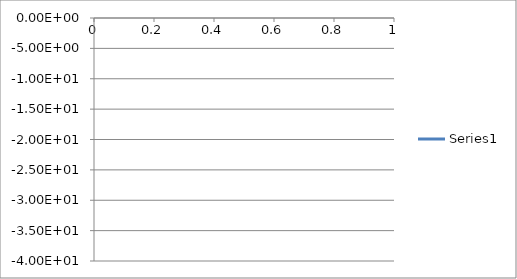
| Category | Series 0 |
|---|---|
| 0 | -36.166 |
| 1 | -36.49 |
| 2 | -37.07 |
| 3 | -37.604 |
| 4 | -38.084 |
| 5 | -37.881 |
| 6 | -36.799 |
| 7 | -35.068 |
| 8 | -33.107 |
| 9 | -31.198 |
| 10 | -29.396 |
| 11 | -27.785 |
| 12 | -26.277 |
| 13 | -24.936 |
| 14 | -23.688 |
| 15 | -22.553 |
| 16 | -21.5 |
| 17 | -20.542 |
| 18 | -19.64 |
| 19 | -18.815 |
| 20 | -18.034 |
| 21 | -17.314 |
| 22 | -16.635 |
| 23 | -16.007 |
| 24 | -15.413 |
| 25 | -14.862 |
| 26 | -14.34 |
| 27 | -13.857 |
| 28 | -13.401 |
| 29 | -12.976 |
| 30 | -12.577 |
| 31 | -12.208 |
| 32 | -11.859 |
| 33 | -11.54 |
| 34 | -11.238 |
| 35 | -10.963 |
| 36 | -10.706 |
| 37 | -10.471 |
| 38 | -10.256 |
| 39 | -10.062 |
| 40 | -9.883 |
| 41 | -9.725 |
| 42 | -9.584 |
| 43 | -9.461 |
| 44 | -9.355 |
| 45 | -9.263 |
| 46 | -9.189 |
| 47 | -9.132 |
| 48 | -9.088 |
| 49 | -9.06 |
| 50 | -9.045 |
| 51 | -9.045 |
| 52 | -9.059 |
| 53 | -9.084 |
| 54 | -9.124 |
| 55 | -9.173 |
| 56 | -9.233 |
| 57 | -9.302 |
| 58 | -9.383 |
| 59 | -9.469 |
| 60 | -9.562 |
| 61 | -9.657 |
| 62 | -9.759 |
| 63 | -9.857 |
| 64 | -9.958 |
| 65 | -10.053 |
| 66 | -10.144 |
| 67 | -10.225 |
| 68 | -10.297 |
| 69 | -10.353 |
| 70 | -10.394 |
| 71 | -10.418 |
| 72 | -10.422 |
| 73 | -10.404 |
| 74 | -10.369 |
| 75 | -10.307 |
| 76 | -10.226 |
| 77 | -10.125 |
| 78 | -10.003 |
| 79 | -9.867 |
| 80 | -9.713 |
| 81 | -9.549 |
| 82 | -9.371 |
| 83 | -9.188 |
| 84 | -8.996 |
| 85 | -8.802 |
| 86 | -8.604 |
| 87 | -8.407 |
| 88 | -8.209 |
| 89 | -8.016 |
| 90 | -7.823 |
| 91 | -7.636 |
| 92 | -7.452 |
| 93 | -7.275 |
| 94 | -7.102 |
| 95 | -6.937 |
| 96 | -6.775 |
| 97 | -6.622 |
| 98 | -6.471 |
| 99 | -6.331 |
| 100 | -6.194 |
| 101 | -6.064 |
| 102 | -5.938 |
| 103 | -5.819 |
| 104 | -5.705 |
| 105 | -5.594 |
| 106 | -5.488 |
| 107 | -5.387 |
| 108 | -5.288 |
| 109 | -5.193 |
| 110 | -5.1 |
| 111 | -5.01 |
| 112 | -4.924 |
| 113 | -4.838 |
| 114 | -4.754 |
| 115 | -4.672 |
| 116 | -4.589 |
| 117 | -4.509 |
| 118 | -4.428 |
| 119 | -4.35 |
| 120 | -4.271 |
| 121 | -4.192 |
| 122 | -4.114 |
| 123 | -4.037 |
| 124 | -3.959 |
| 125 | -3.883 |
| 126 | -3.807 |
| 127 | -3.733 |
| 128 | -3.659 |
| 129 | -3.586 |
| 130 | -3.514 |
| 131 | -3.446 |
| 132 | -3.377 |
| 133 | -3.312 |
| 134 | -3.25 |
| 135 | -3.19 |
| 136 | -3.133 |
| 137 | -3.079 |
| 138 | -3.029 |
| 139 | -2.984 |
| 140 | -2.94 |
| 141 | -2.903 |
| 142 | -2.869 |
| 143 | -2.84 |
| 144 | -2.816 |
| 145 | -2.797 |
| 146 | -2.783 |
| 147 | -2.775 |
| 148 | -2.772 |
| 149 | -2.773 |
| 150 | -2.782 |
| 151 | -2.795 |
| 152 | -2.816 |
| 153 | -2.839 |
| 154 | -2.87 |
| 155 | -2.907 |
| 156 | -2.948 |
| 157 | -2.995 |
| 158 | -3.047 |
| 159 | -3.106 |
| 160 | -3.167 |
| 161 | -3.234 |
| 162 | -3.307 |
| 163 | -3.381 |
| 164 | -3.462 |
| 165 | -3.545 |
| 166 | -3.629 |
| 167 | -3.718 |
| 168 | -3.807 |
| 169 | -3.897 |
| 170 | -3.988 |
| 171 | -4.078 |
| 172 | -4.168 |
| 173 | -4.254 |
| 174 | -4.34 |
| 175 | -4.421 |
| 176 | -4.497 |
| 177 | -4.567 |
| 178 | -4.631 |
| 179 | -4.688 |
| 180 | -4.738 |
| 181 | -4.776 |
| 182 | -4.807 |
| 183 | -4.827 |
| 184 | -4.838 |
| 185 | -4.836 |
| 186 | -4.825 |
| 187 | -4.804 |
| 188 | -4.771 |
| 189 | -4.729 |
| 190 | -4.676 |
| 191 | -4.614 |
| 192 | -4.543 |
| 193 | -4.463 |
| 194 | -4.378 |
| 195 | -4.286 |
| 196 | -4.188 |
| 197 | -4.085 |
| 198 | -3.979 |
| 199 | -3.869 |
| 200 | -3.756 |
| 201 | -3.643 |
| 202 | -3.527 |
| 203 | -3.412 |
| 204 | -3.297 |
| 205 | -3.181 |
| 206 | -3.07 |
| 207 | -2.961 |
| 208 | -2.852 |
| 209 | -2.745 |
| 210 | -2.643 |
| 211 | -2.544 |
| 212 | -2.449 |
| 213 | -2.356 |
| 214 | -2.269 |
| 215 | -2.187 |
| 216 | -2.107 |
| 217 | -2.034 |
| 218 | -1.963 |
| 219 | -1.9 |
| 220 | -1.841 |
| 221 | -1.785 |
| 222 | -1.738 |
| 223 | -1.695 |
| 224 | -1.656 |
| 225 | -1.623 |
| 226 | -1.596 |
| 227 | -1.575 |
| 228 | -1.56 |
| 229 | -1.55 |
| 230 | -1.545 |
| 231 | -1.548 |
| 232 | -1.555 |
| 233 | -1.569 |
| 234 | -1.589 |
| 235 | -1.616 |
| 236 | -1.646 |
| 237 | -1.684 |
| 238 | -1.728 |
| 239 | -1.779 |
| 240 | -1.837 |
| 241 | -1.897 |
| 242 | -1.968 |
| 243 | -2.042 |
| 244 | -2.122 |
| 245 | -2.207 |
| 246 | -2.3 |
| 247 | -2.398 |
| 248 | -2.501 |
| 249 | -2.608 |
| 250 | -2.721 |
| 251 | -2.839 |
| 252 | -2.96 |
| 253 | -3.084 |
| 254 | -3.213 |
| 255 | -3.342 |
| 256 | -3.474 |
| 257 | -3.605 |
| 258 | -3.739 |
| 259 | -3.869 |
| 260 | -3.998 |
| 261 | -4.121 |
| 262 | -4.242 |
| 263 | -4.357 |
| 264 | -4.461 |
| 265 | -4.556 |
| 266 | -4.641 |
| 267 | -4.713 |
| 268 | -4.772 |
| 269 | -4.815 |
| 270 | -4.843 |
| 271 | -4.853 |
| 272 | -4.846 |
| 273 | -4.82 |
| 274 | -4.778 |
| 275 | -4.719 |
| 276 | -4.645 |
| 277 | -4.552 |
| 278 | -4.449 |
| 279 | -4.333 |
| 280 | -4.207 |
| 281 | -4.068 |
| 282 | -3.923 |
| 283 | -3.771 |
| 284 | -3.618 |
| 285 | -3.456 |
| 286 | -3.297 |
| 287 | -3.137 |
| 288 | -2.976 |
| 289 | -2.813 |
| 290 | -2.658 |
| 291 | -2.502 |
| 292 | -2.353 |
| 293 | -2.206 |
| 294 | -2.067 |
| 295 | -1.931 |
| 296 | -1.801 |
| 297 | -1.675 |
| 298 | -1.56 |
| 299 | -1.447 |
| 300 | -1.344 |
| 301 | -1.243 |
| 302 | -1.153 |
| 303 | -1.068 |
| 304 | -0.99 |
| 305 | -0.917 |
| 306 | -0.852 |
| 307 | -0.792 |
| 308 | -0.74 |
| 309 | -0.693 |
| 310 | -0.654 |
| 311 | -0.62 |
| 312 | -0.592 |
| 313 | -0.568 |
| 314 | -0.554 |
| 315 | -0.541 |
| 316 | -0.533 |
| 317 | -0.532 |
| 318 | -0.536 |
| 319 | -0.541 |
| 320 | -0.552 |
| 321 | -0.566 |
| 322 | -0.585 |
| 323 | -0.604 |
| 324 | -0.631 |
| 325 | -0.656 |
| 326 | -0.684 |
| 327 | -0.714 |
| 328 | -0.747 |
| 329 | -0.777 |
| 330 | -0.811 |
| 331 | -0.839 |
| 332 | -0.874 |
| 333 | -0.905 |
| 334 | -0.937 |
| 335 | -0.962 |
| 336 | -0.993 |
| 337 | -1.015 |
| 338 | -1.039 |
| 339 | -1.058 |
| 340 | -1.076 |
| 341 | -1.088 |
| 342 | -1.103 |
| 343 | -1.107 |
| 344 | -1.118 |
| 345 | -1.118 |
| 346 | -1.122 |
| 347 | -1.115 |
| 348 | -1.117 |
| 349 | -1.105 |
| 350 | -1.098 |
| 351 | -1.086 |
| 352 | -1.076 |
| 353 | -1.059 |
| 354 | -1.052 |
| 355 | -1.034 |
| 356 | -1.025 |
| 357 | -1.009 |
| 358 | -1.001 |
| 359 | -0.986 |
| 360 | -0.98 |
| 361 | -0.969 |
| 362 | -0.967 |
| 363 | -0.962 |
| 364 | -0.96 |
| 365 | -0.957 |
| 366 | -0.963 |
| 367 | -0.96 |
| 368 | -0.97 |
| 369 | -0.974 |
| 370 | -0.99 |
| 371 | -1.001 |
| 372 | -1.024 |
| 373 | -1.034 |
| 374 | -1.058 |
| 375 | -1.076 |
| 376 | -1.107 |
| 377 | -1.13 |
| 378 | -1.163 |
| 379 | -1.187 |
| 380 | -1.227 |
| 381 | -1.258 |
| 382 | -1.302 |
| 383 | -1.329 |
| 384 | -1.376 |
| 385 | -1.409 |
| 386 | -1.459 |
| 387 | -1.489 |
| 388 | -1.54 |
| 389 | -1.579 |
| 390 | -1.636 |
| 391 | -1.664 |
| 392 | -1.723 |
| 393 | -1.764 |
| 394 | -1.818 |
| 395 | -1.856 |
| 396 | -1.916 |
| 397 | -1.958 |
| 398 | -2.026 |
| 399 | -2.049 |
| 400 | -2.124 |